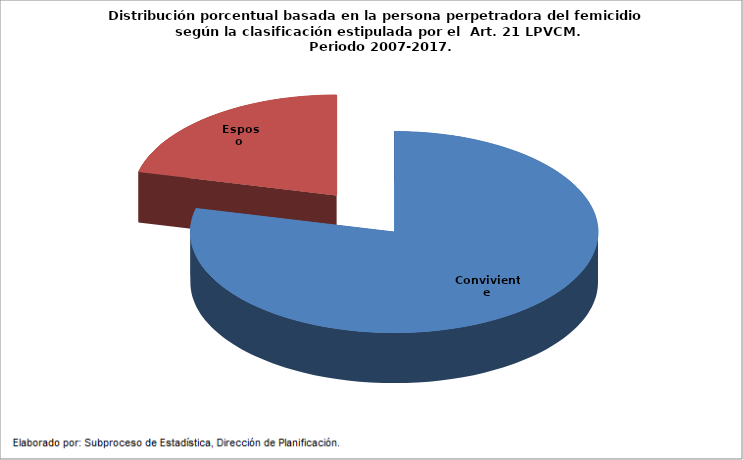
| Category | Porcentaje de recurrencia |
|---|---|
| Conviviente | 0.788 |
| Esposo | 0.212 |